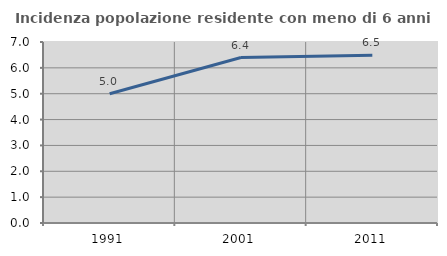
| Category | Incidenza popolazione residente con meno di 6 anni |
|---|---|
| 1991.0 | 5 |
| 2001.0 | 6.399 |
| 2011.0 | 6.488 |